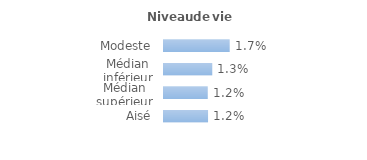
| Category | Series 0 |
|---|---|
| Modeste | 0.017 |
| Médian inférieur | 0.013 |
| Médian supérieur | 0.012 |
| Aisé | 0.012 |